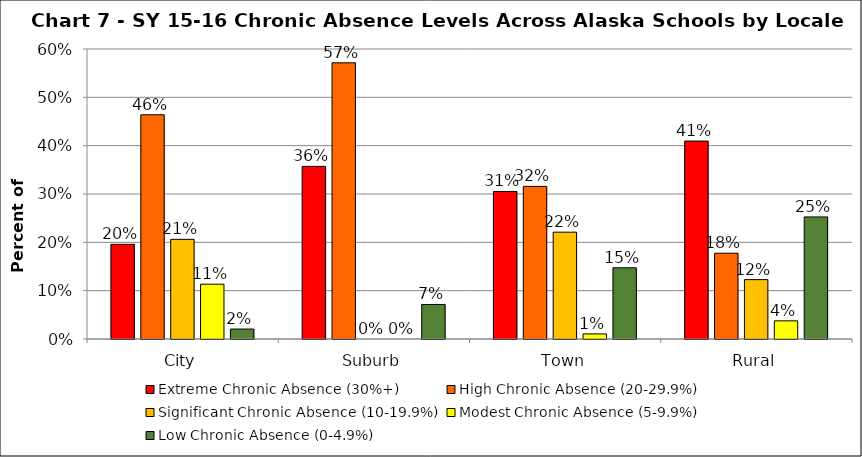
| Category | Extreme Chronic Absence (30%+) | High Chronic Absence (20-29.9%) | Significant Chronic Absence (10-19.9%) | Modest Chronic Absence (5-9.9%) | Low Chronic Absence (0-4.9%) |
|---|---|---|---|---|---|
| 0 | 0.196 | 0.464 | 0.206 | 0.113 | 0.021 |
| 1 | 0.357 | 0.571 | 0 | 0 | 0.071 |
| 2 | 0.305 | 0.316 | 0.221 | 0.011 | 0.147 |
| 3 | 0.41 | 0.177 | 0.123 | 0.038 | 0.253 |